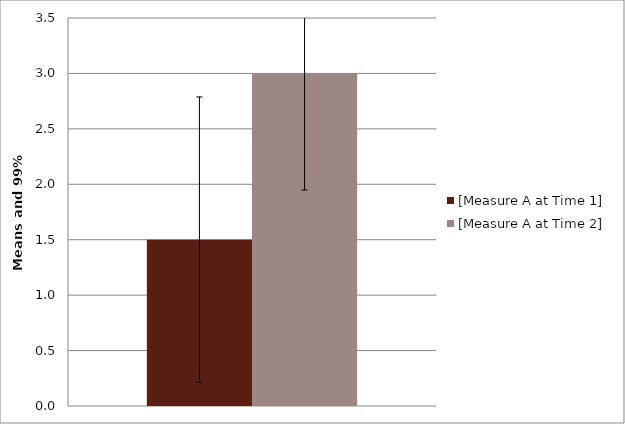
| Category | [Measure A at Time 1] | [Measure A at Time 2] |
|---|---|---|
| 0 | 1.5 | 3 |